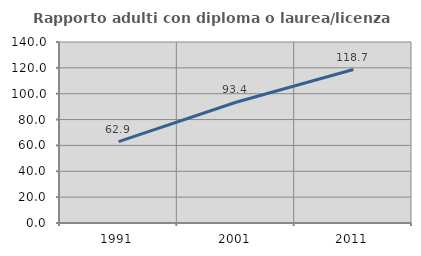
| Category | Rapporto adulti con diploma o laurea/licenza media  |
|---|---|
| 1991.0 | 62.919 |
| 2001.0 | 93.382 |
| 2011.0 | 118.686 |